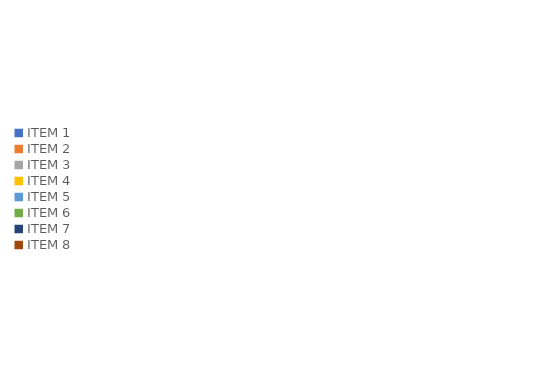
| Category | Series 0 | Series 1 |
|---|---|---|
| ITEM 1 | 0 | 0 |
| ITEM 2 | 0 | 0 |
| ITEM 3 | 0 | 0 |
| ITEM 4 | 0 | 0 |
| ITEM 5 | 0 | 0 |
| ITEM 6 | 0 | 0 |
| ITEM 7 | 0 | 0 |
| ITEM 8 | 0 | 0 |